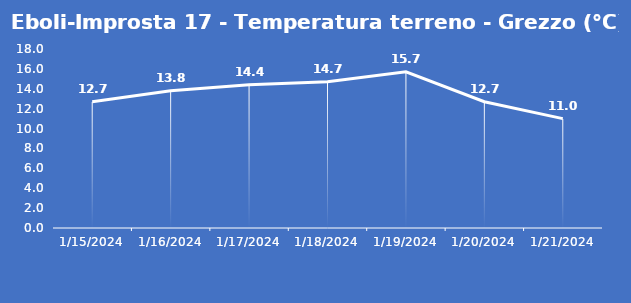
| Category | Eboli-Improsta 17 - Temperatura terreno - Grezzo (°C) |
|---|---|
| 1/15/24 | 12.7 |
| 1/16/24 | 13.8 |
| 1/17/24 | 14.4 |
| 1/18/24 | 14.7 |
| 1/19/24 | 15.7 |
| 1/20/24 | 12.7 |
| 1/21/24 | 11 |